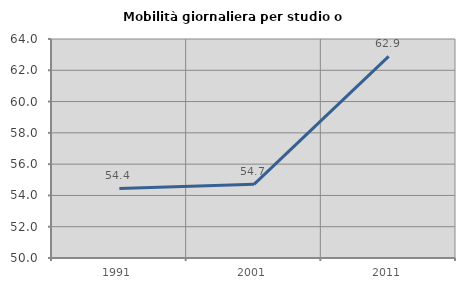
| Category | Mobilità giornaliera per studio o lavoro |
|---|---|
| 1991.0 | 54.447 |
| 2001.0 | 54.709 |
| 2011.0 | 62.893 |